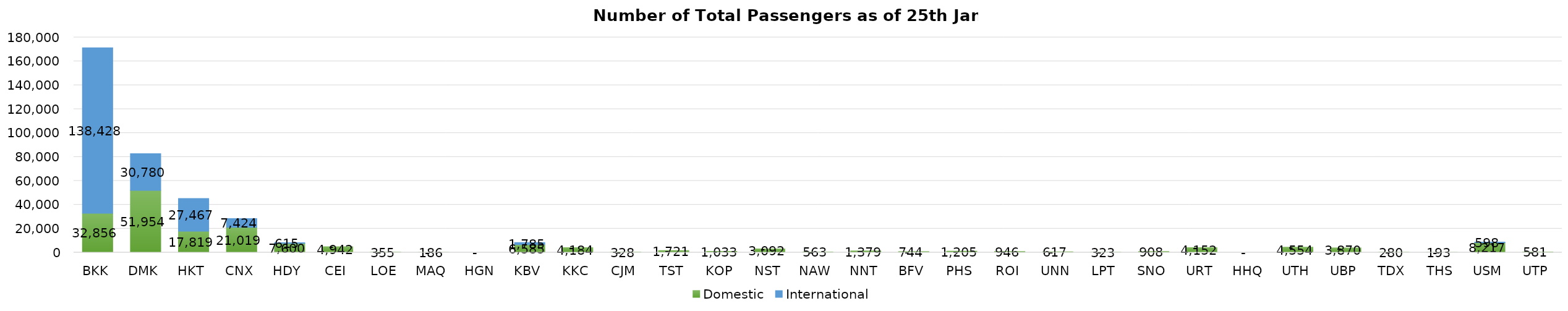
| Category | Domestic | International |
|---|---|---|
| BKK | 32856 | 138428 |
| DMK | 51954 | 30780 |
| HKT | 17819 | 27467 |
| CNX | 21019 | 7424 |
| HDY | 7600 | 615 |
| CEI | 4942 | 0 |
| LOE | 355 | 0 |
| MAQ | 186 | 0 |
| HGN | 0 | 0 |
| KBV | 6585 | 1785 |
| KKC | 4184 | 0 |
| CJM | 328 | 0 |
| TST | 1721 | 0 |
| KOP | 1033 | 0 |
| NST | 3092 | 0 |
| NAW | 563 | 0 |
| NNT | 1379 | 0 |
| BFV | 744 | 0 |
| PHS | 1205 | 0 |
| ROI | 946 | 0 |
| UNN | 617 | 0 |
| LPT | 323 | 0 |
| SNO | 908 | 0 |
| URT | 4152 | 0 |
| HHQ | 0 | 0 |
| UTH | 4554 | 0 |
| UBP | 3870 | 0 |
| TDX | 280 | 0 |
| THS | 193 | 0 |
| USM | 8217 | 598 |
| UTP | 581 | 0 |